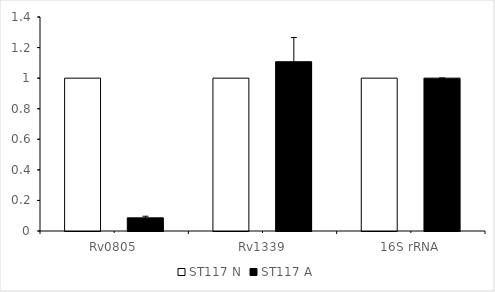
| Category | ST117 N | ST117 A |
|---|---|---|
| Rv0805 | 1 | 0.086 |
| Rv1339 | 1 | 1.107 |
| 16S rRNA | 1 | 1 |